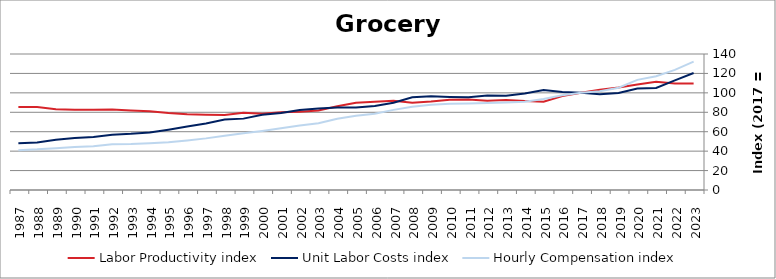
| Category | Labor Productivity index | Unit Labor Costs index | Hourly Compensation index |
|---|---|---|---|
| 2023.0 | 109.743 | 120.391 | 132.12 |
| 2022.0 | 109.543 | 112.85 | 123.619 |
| 2021.0 | 111.527 | 105.06 | 117.17 |
| 2020.0 | 108.579 | 104.443 | 113.403 |
| 2019.0 | 105.419 | 99.888 | 105.301 |
| 2018.0 | 103.143 | 98.579 | 101.677 |
| 2017.0 | 100 | 100 | 100 |
| 2016.0 | 96.671 | 100.842 | 97.485 |
| 2015.0 | 90.937 | 103.023 | 93.687 |
| 2014.0 | 91.624 | 99.263 | 90.948 |
| 2013.0 | 92.765 | 97.135 | 90.107 |
| 2012.0 | 91.912 | 97.398 | 89.52 |
| 2011.0 | 93.273 | 95.499 | 89.075 |
| 2010.0 | 92.817 | 95.788 | 88.907 |
| 2009.0 | 91.07 | 96.491 | 87.875 |
| 2008.0 | 89.768 | 95.407 | 85.645 |
| 2007.0 | 91.91 | 89.753 | 82.492 |
| 2006.0 | 90.721 | 86.573 | 78.539 |
| 2005.0 | 89.926 | 85.014 | 76.45 |
| 2004.0 | 86.282 | 84.939 | 73.287 |
| 2003.0 | 81.843 | 83.994 | 68.744 |
| 2002.0 | 80.492 | 82.433 | 66.352 |
| 2001.0 | 80.118 | 79.304 | 63.536 |
| 2000.0 | 78.414 | 77.451 | 60.732 |
| 1999.0 | 79.434 | 73.47 | 58.36 |
| 1998.0 | 77.178 | 72.485 | 55.942 |
| 1997.0 | 77.519 | 68.562 | 53.149 |
| 1996.0 | 78.096 | 65.276 | 50.978 |
| 1995.0 | 79.21 | 62.124 | 49.208 |
| 1994.0 | 81.148 | 59.284 | 48.108 |
| 1993.0 | 81.958 | 57.832 | 47.399 |
| 1992.0 | 82.992 | 56.888 | 47.212 |
| 1991.0 | 82.647 | 54.616 | 45.138 |
| 1990.0 | 82.536 | 53.62 | 44.256 |
| 1989.0 | 83.17 | 51.784 | 43.069 |
| 1988.0 | 85.362 | 48.993 | 41.822 |
| 1987.0 | 85.356 | 48.075 | 41.035 |